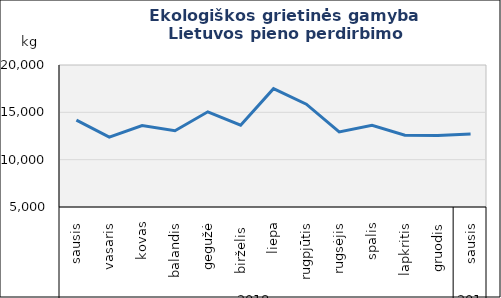
| Category | Grietinė |
|---|---|
| 0 | 14182 |
| 1 | 12385 |
| 2 | 13601 |
| 3 | 13053 |
| 4 | 15055 |
| 5 | 13640 |
| 6 | 17496 |
| 7 | 15862 |
| 8 | 12923 |
| 9 | 13635 |
| 10 | 12589 |
| 11 | 12540 |
| 12 | 12715 |